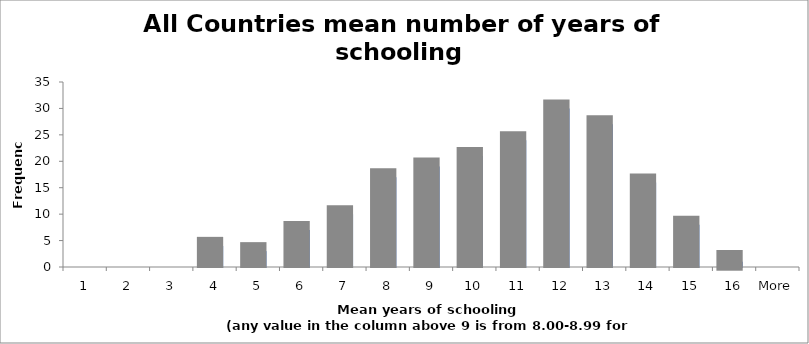
| Category | Frequency |
|---|---|
| 1 | 0 |
| 2 | 0 |
| 3 | 0 |
| 4 | 4 |
| 5 | 3 |
| 6 | 7 |
| 7 | 10 |
| 8 | 17 |
| 9 | 19 |
| 10 | 21 |
| 11 | 24 |
| 12 | 30 |
| 13 | 27 |
| 14 | 16 |
| 15 | 8 |
| 16 | 1 |
| More | 0 |